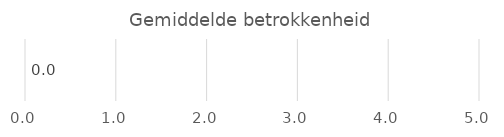
| Category | Series 0 |
|---|---|
| Betrokkenheid | 0 |